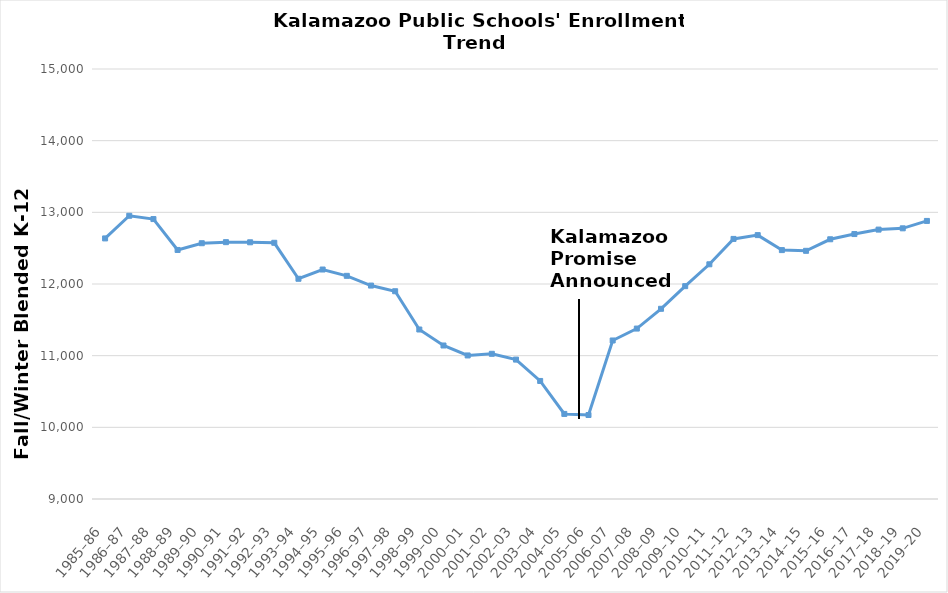
| Category | Fall/Winter Blended K-12 Headcount |
|---|---|
| 1985–86 | 12636 |
| 1986–87 | 12952 |
| 1987–88 | 12906 |
| 1988–89 | 12475 |
| 1989–90 | 12569 |
| 1990–91 | 12584 |
| 1991–92 | 12582 |
| 1992–93 | 12575 |
| 1993–94 | 12073 |
| 1994–95 | 12202 |
| 1995–96 | 12114 |
| 1996–97 | 11978 |
| 1997–98 | 11899 |
| 1998–99 | 11365 |
| 1999–00 | 11142 |
| 2000–01 | 11003 |
| 2001–02 | 11026 |
| 2002–03 | 10945 |
| 2003–04 | 10647 |
| 2004–05 | 10187 |
| 2005–06 | 10172 |
| 2006–07 | 11212 |
| 2007–08 | 11378 |
| 2008–09 | 11654 |
| 2009–10 | 11970 |
| 2010–11 | 12275 |
| 2011–12 | 12629 |
| 2012–13 | 12682 |
| 2013–14 | 12473 |
| 2014–15 | 12463 |
| 2015–16 | 12624 |
| 2016–17 | 12697 |
| 2017–18 | 12759 |
| 2018–19 | 12777 |
| 2019–20 | 12880 |